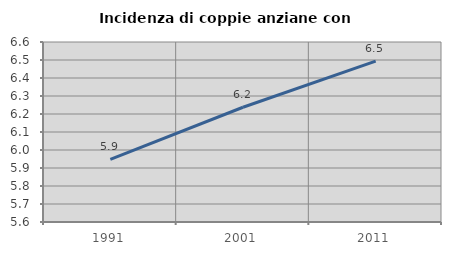
| Category | Incidenza di coppie anziane con figli |
|---|---|
| 1991.0 | 5.948 |
| 2001.0 | 6.237 |
| 2011.0 | 6.494 |